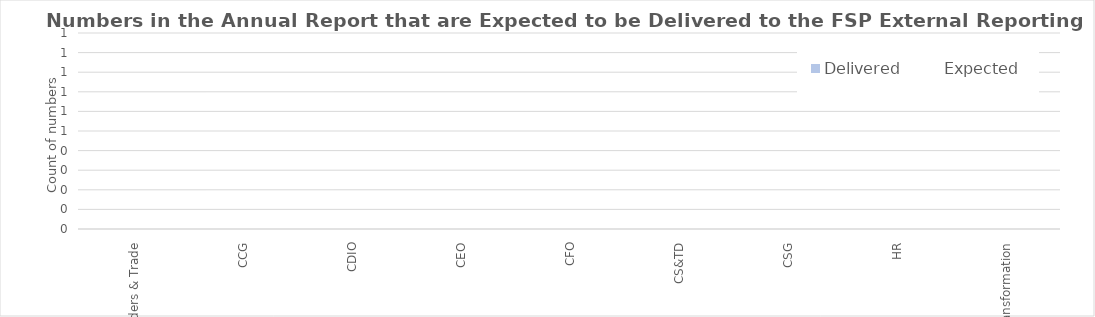
| Category | Delivered |
|---|---|
| Borders & Trade | 0 |
| CCG | 0 |
| CDIO | 0 |
| CEO | 0 |
| CFO | 0 |
| CS&TD | 0 |
| CSG | 0 |
| HR | 0 |
| Transformation | 0 |